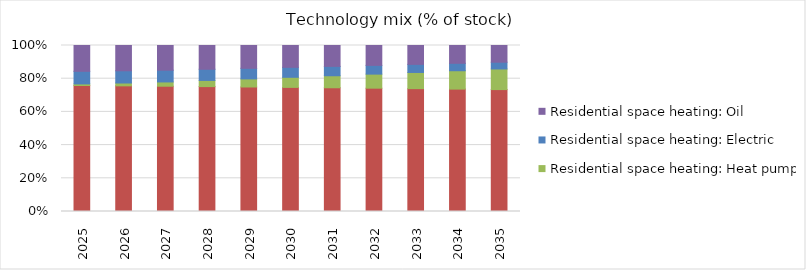
| Category | Residential space heating: Gas | Residential space heating: Heat pump | Residential space heating: Electric | Residential space heating: Oil |
|---|---|---|---|---|
| 2025.0 | 0.759 | 0.009 | 0.076 | 0.155 |
| 2026.0 | 0.757 | 0.017 | 0.074 | 0.152 |
| 2027.0 | 0.755 | 0.026 | 0.071 | 0.149 |
| 2028.0 | 0.752 | 0.037 | 0.067 | 0.143 |
| 2029.0 | 0.75 | 0.049 | 0.064 | 0.137 |
| 2030.0 | 0.748 | 0.061 | 0.06 | 0.131 |
| 2031.0 | 0.745 | 0.072 | 0.056 | 0.126 |
| 2032.0 | 0.743 | 0.085 | 0.053 | 0.12 |
| 2033.0 | 0.74 | 0.097 | 0.049 | 0.114 |
| 2034.0 | 0.737 | 0.111 | 0.045 | 0.107 |
| 2035.0 | 0.734 | 0.124 | 0.041 | 0.101 |